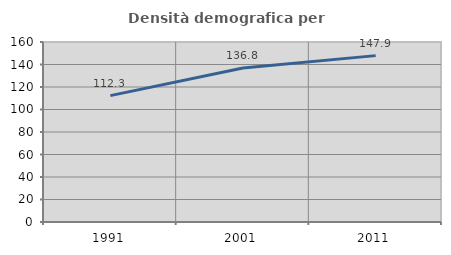
| Category | Densità demografica |
|---|---|
| 1991.0 | 112.335 |
| 2001.0 | 136.843 |
| 2011.0 | 147.894 |